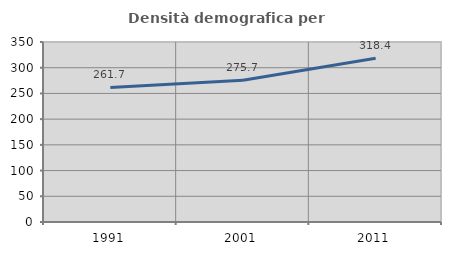
| Category | Densità demografica |
|---|---|
| 1991.0 | 261.74 |
| 2001.0 | 275.728 |
| 2011.0 | 318.448 |